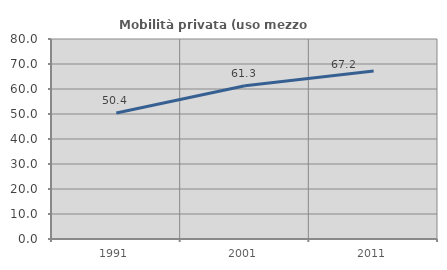
| Category | Mobilità privata (uso mezzo privato) |
|---|---|
| 1991.0 | 50.398 |
| 2001.0 | 61.275 |
| 2011.0 | 67.176 |